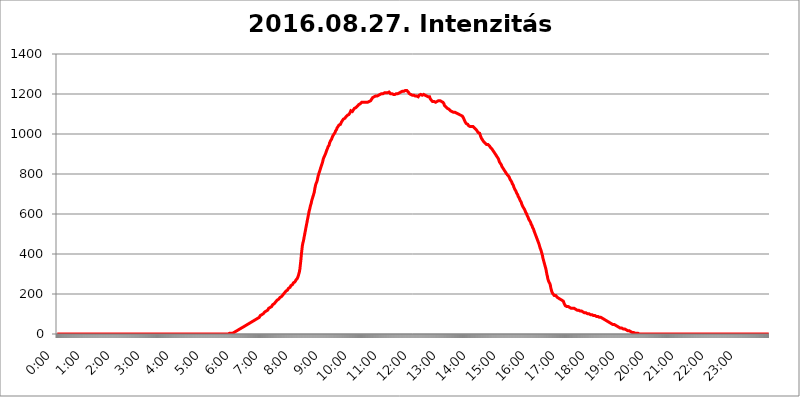
| Category | 2016.08.27. Intenzitás [W/m^2] |
|---|---|
| 0.0 | 0 |
| 0.0006944444444444445 | 0 |
| 0.001388888888888889 | 0 |
| 0.0020833333333333333 | 0 |
| 0.002777777777777778 | 0 |
| 0.003472222222222222 | 0 |
| 0.004166666666666667 | 0 |
| 0.004861111111111111 | 0 |
| 0.005555555555555556 | 0 |
| 0.0062499999999999995 | 0 |
| 0.006944444444444444 | 0 |
| 0.007638888888888889 | 0 |
| 0.008333333333333333 | 0 |
| 0.009027777777777779 | 0 |
| 0.009722222222222222 | 0 |
| 0.010416666666666666 | 0 |
| 0.011111111111111112 | 0 |
| 0.011805555555555555 | 0 |
| 0.012499999999999999 | 0 |
| 0.013194444444444444 | 0 |
| 0.013888888888888888 | 0 |
| 0.014583333333333332 | 0 |
| 0.015277777777777777 | 0 |
| 0.015972222222222224 | 0 |
| 0.016666666666666666 | 0 |
| 0.017361111111111112 | 0 |
| 0.018055555555555557 | 0 |
| 0.01875 | 0 |
| 0.019444444444444445 | 0 |
| 0.02013888888888889 | 0 |
| 0.020833333333333332 | 0 |
| 0.02152777777777778 | 0 |
| 0.022222222222222223 | 0 |
| 0.02291666666666667 | 0 |
| 0.02361111111111111 | 0 |
| 0.024305555555555556 | 0 |
| 0.024999999999999998 | 0 |
| 0.025694444444444447 | 0 |
| 0.02638888888888889 | 0 |
| 0.027083333333333334 | 0 |
| 0.027777777777777776 | 0 |
| 0.02847222222222222 | 0 |
| 0.029166666666666664 | 0 |
| 0.029861111111111113 | 0 |
| 0.030555555555555555 | 0 |
| 0.03125 | 0 |
| 0.03194444444444445 | 0 |
| 0.03263888888888889 | 0 |
| 0.03333333333333333 | 0 |
| 0.034027777777777775 | 0 |
| 0.034722222222222224 | 0 |
| 0.035416666666666666 | 0 |
| 0.036111111111111115 | 0 |
| 0.03680555555555556 | 0 |
| 0.0375 | 0 |
| 0.03819444444444444 | 0 |
| 0.03888888888888889 | 0 |
| 0.03958333333333333 | 0 |
| 0.04027777777777778 | 0 |
| 0.04097222222222222 | 0 |
| 0.041666666666666664 | 0 |
| 0.042361111111111106 | 0 |
| 0.04305555555555556 | 0 |
| 0.043750000000000004 | 0 |
| 0.044444444444444446 | 0 |
| 0.04513888888888889 | 0 |
| 0.04583333333333334 | 0 |
| 0.04652777777777778 | 0 |
| 0.04722222222222222 | 0 |
| 0.04791666666666666 | 0 |
| 0.04861111111111111 | 0 |
| 0.049305555555555554 | 0 |
| 0.049999999999999996 | 0 |
| 0.05069444444444445 | 0 |
| 0.051388888888888894 | 0 |
| 0.052083333333333336 | 0 |
| 0.05277777777777778 | 0 |
| 0.05347222222222222 | 0 |
| 0.05416666666666667 | 0 |
| 0.05486111111111111 | 0 |
| 0.05555555555555555 | 0 |
| 0.05625 | 0 |
| 0.05694444444444444 | 0 |
| 0.057638888888888885 | 0 |
| 0.05833333333333333 | 0 |
| 0.05902777777777778 | 0 |
| 0.059722222222222225 | 0 |
| 0.06041666666666667 | 0 |
| 0.061111111111111116 | 0 |
| 0.06180555555555556 | 0 |
| 0.0625 | 0 |
| 0.06319444444444444 | 0 |
| 0.06388888888888888 | 0 |
| 0.06458333333333334 | 0 |
| 0.06527777777777778 | 0 |
| 0.06597222222222222 | 0 |
| 0.06666666666666667 | 0 |
| 0.06736111111111111 | 0 |
| 0.06805555555555555 | 0 |
| 0.06874999999999999 | 0 |
| 0.06944444444444443 | 0 |
| 0.07013888888888889 | 0 |
| 0.07083333333333333 | 0 |
| 0.07152777777777779 | 0 |
| 0.07222222222222223 | 0 |
| 0.07291666666666667 | 0 |
| 0.07361111111111111 | 0 |
| 0.07430555555555556 | 0 |
| 0.075 | 0 |
| 0.07569444444444444 | 0 |
| 0.0763888888888889 | 0 |
| 0.07708333333333334 | 0 |
| 0.07777777777777778 | 0 |
| 0.07847222222222222 | 0 |
| 0.07916666666666666 | 0 |
| 0.0798611111111111 | 0 |
| 0.08055555555555556 | 0 |
| 0.08125 | 0 |
| 0.08194444444444444 | 0 |
| 0.08263888888888889 | 0 |
| 0.08333333333333333 | 0 |
| 0.08402777777777777 | 0 |
| 0.08472222222222221 | 0 |
| 0.08541666666666665 | 0 |
| 0.08611111111111112 | 0 |
| 0.08680555555555557 | 0 |
| 0.08750000000000001 | 0 |
| 0.08819444444444445 | 0 |
| 0.08888888888888889 | 0 |
| 0.08958333333333333 | 0 |
| 0.09027777777777778 | 0 |
| 0.09097222222222222 | 0 |
| 0.09166666666666667 | 0 |
| 0.09236111111111112 | 0 |
| 0.09305555555555556 | 0 |
| 0.09375 | 0 |
| 0.09444444444444444 | 0 |
| 0.09513888888888888 | 0 |
| 0.09583333333333333 | 0 |
| 0.09652777777777777 | 0 |
| 0.09722222222222222 | 0 |
| 0.09791666666666667 | 0 |
| 0.09861111111111111 | 0 |
| 0.09930555555555555 | 0 |
| 0.09999999999999999 | 0 |
| 0.10069444444444443 | 0 |
| 0.1013888888888889 | 0 |
| 0.10208333333333335 | 0 |
| 0.10277777777777779 | 0 |
| 0.10347222222222223 | 0 |
| 0.10416666666666667 | 0 |
| 0.10486111111111111 | 0 |
| 0.10555555555555556 | 0 |
| 0.10625 | 0 |
| 0.10694444444444444 | 0 |
| 0.1076388888888889 | 0 |
| 0.10833333333333334 | 0 |
| 0.10902777777777778 | 0 |
| 0.10972222222222222 | 0 |
| 0.1111111111111111 | 0 |
| 0.11180555555555556 | 0 |
| 0.11180555555555556 | 0 |
| 0.1125 | 0 |
| 0.11319444444444444 | 0 |
| 0.11388888888888889 | 0 |
| 0.11458333333333333 | 0 |
| 0.11527777777777777 | 0 |
| 0.11597222222222221 | 0 |
| 0.11666666666666665 | 0 |
| 0.1173611111111111 | 0 |
| 0.11805555555555557 | 0 |
| 0.11944444444444445 | 0 |
| 0.12013888888888889 | 0 |
| 0.12083333333333333 | 0 |
| 0.12152777777777778 | 0 |
| 0.12222222222222223 | 0 |
| 0.12291666666666667 | 0 |
| 0.12291666666666667 | 0 |
| 0.12361111111111112 | 0 |
| 0.12430555555555556 | 0 |
| 0.125 | 0 |
| 0.12569444444444444 | 0 |
| 0.12638888888888888 | 0 |
| 0.12708333333333333 | 0 |
| 0.16875 | 0 |
| 0.12847222222222224 | 0 |
| 0.12916666666666668 | 0 |
| 0.12986111111111112 | 0 |
| 0.13055555555555556 | 0 |
| 0.13125 | 0 |
| 0.13194444444444445 | 0 |
| 0.1326388888888889 | 0 |
| 0.13333333333333333 | 0 |
| 0.13402777777777777 | 0 |
| 0.13402777777777777 | 0 |
| 0.13472222222222222 | 0 |
| 0.13541666666666666 | 0 |
| 0.1361111111111111 | 0 |
| 0.13749999999999998 | 0 |
| 0.13819444444444443 | 0 |
| 0.1388888888888889 | 0 |
| 0.13958333333333334 | 0 |
| 0.14027777777777778 | 0 |
| 0.14097222222222222 | 0 |
| 0.14166666666666666 | 0 |
| 0.1423611111111111 | 0 |
| 0.14305555555555557 | 0 |
| 0.14375000000000002 | 0 |
| 0.14444444444444446 | 0 |
| 0.1451388888888889 | 0 |
| 0.1451388888888889 | 0 |
| 0.14652777777777778 | 0 |
| 0.14722222222222223 | 0 |
| 0.14791666666666667 | 0 |
| 0.1486111111111111 | 0 |
| 0.14930555555555555 | 0 |
| 0.15 | 0 |
| 0.15069444444444444 | 0 |
| 0.15138888888888888 | 0 |
| 0.15208333333333332 | 0 |
| 0.15277777777777776 | 0 |
| 0.15347222222222223 | 0 |
| 0.15416666666666667 | 0 |
| 0.15486111111111112 | 0 |
| 0.15555555555555556 | 0 |
| 0.15625 | 0 |
| 0.15694444444444444 | 0 |
| 0.15763888888888888 | 0 |
| 0.15833333333333333 | 0 |
| 0.15902777777777777 | 0 |
| 0.15972222222222224 | 0 |
| 0.16041666666666668 | 0 |
| 0.16111111111111112 | 0 |
| 0.16180555555555556 | 0 |
| 0.1625 | 0 |
| 0.16319444444444445 | 0 |
| 0.1638888888888889 | 0 |
| 0.16458333333333333 | 0 |
| 0.16527777777777777 | 0 |
| 0.16597222222222222 | 0 |
| 0.16666666666666666 | 0 |
| 0.1673611111111111 | 0 |
| 0.16805555555555554 | 0 |
| 0.16874999999999998 | 0 |
| 0.16944444444444443 | 0 |
| 0.17013888888888887 | 0 |
| 0.1708333333333333 | 0 |
| 0.17152777777777775 | 0 |
| 0.17222222222222225 | 0 |
| 0.1729166666666667 | 0 |
| 0.17361111111111113 | 0 |
| 0.17430555555555557 | 0 |
| 0.17500000000000002 | 0 |
| 0.17569444444444446 | 0 |
| 0.1763888888888889 | 0 |
| 0.17708333333333334 | 0 |
| 0.17777777777777778 | 0 |
| 0.17847222222222223 | 0 |
| 0.17916666666666667 | 0 |
| 0.1798611111111111 | 0 |
| 0.18055555555555555 | 0 |
| 0.18125 | 0 |
| 0.18194444444444444 | 0 |
| 0.1826388888888889 | 0 |
| 0.18333333333333335 | 0 |
| 0.1840277777777778 | 0 |
| 0.18472222222222223 | 0 |
| 0.18541666666666667 | 0 |
| 0.18611111111111112 | 0 |
| 0.18680555555555556 | 0 |
| 0.1875 | 0 |
| 0.18819444444444444 | 0 |
| 0.18888888888888888 | 0 |
| 0.18958333333333333 | 0 |
| 0.19027777777777777 | 0 |
| 0.1909722222222222 | 0 |
| 0.19166666666666665 | 0 |
| 0.19236111111111112 | 0 |
| 0.19305555555555554 | 0 |
| 0.19375 | 0 |
| 0.19444444444444445 | 0 |
| 0.1951388888888889 | 0 |
| 0.19583333333333333 | 0 |
| 0.19652777777777777 | 0 |
| 0.19722222222222222 | 0 |
| 0.19791666666666666 | 0 |
| 0.1986111111111111 | 0 |
| 0.19930555555555554 | 0 |
| 0.19999999999999998 | 0 |
| 0.20069444444444443 | 0 |
| 0.20138888888888887 | 0 |
| 0.2020833333333333 | 0 |
| 0.2027777777777778 | 0 |
| 0.2034722222222222 | 0 |
| 0.2041666666666667 | 0 |
| 0.20486111111111113 | 0 |
| 0.20555555555555557 | 0 |
| 0.20625000000000002 | 0 |
| 0.20694444444444446 | 0 |
| 0.2076388888888889 | 0 |
| 0.20833333333333334 | 0 |
| 0.20902777777777778 | 0 |
| 0.20972222222222223 | 0 |
| 0.21041666666666667 | 0 |
| 0.2111111111111111 | 0 |
| 0.21180555555555555 | 0 |
| 0.2125 | 0 |
| 0.21319444444444444 | 0 |
| 0.2138888888888889 | 0 |
| 0.21458333333333335 | 0 |
| 0.2152777777777778 | 0 |
| 0.21597222222222223 | 0 |
| 0.21666666666666667 | 0 |
| 0.21736111111111112 | 0 |
| 0.21805555555555556 | 0 |
| 0.21875 | 0 |
| 0.21944444444444444 | 0 |
| 0.22013888888888888 | 0 |
| 0.22083333333333333 | 0 |
| 0.22152777777777777 | 0 |
| 0.2222222222222222 | 0 |
| 0.22291666666666665 | 0 |
| 0.2236111111111111 | 0 |
| 0.22430555555555556 | 0 |
| 0.225 | 0 |
| 0.22569444444444445 | 0 |
| 0.2263888888888889 | 0 |
| 0.22708333333333333 | 0 |
| 0.22777777777777777 | 0 |
| 0.22847222222222222 | 0 |
| 0.22916666666666666 | 0 |
| 0.2298611111111111 | 0 |
| 0.23055555555555554 | 0 |
| 0.23124999999999998 | 0 |
| 0.23194444444444443 | 0 |
| 0.23263888888888887 | 0 |
| 0.2333333333333333 | 0 |
| 0.2340277777777778 | 0 |
| 0.2347222222222222 | 0 |
| 0.2354166666666667 | 0 |
| 0.23611111111111113 | 0 |
| 0.23680555555555557 | 0 |
| 0.23750000000000002 | 0 |
| 0.23819444444444446 | 0 |
| 0.2388888888888889 | 0 |
| 0.23958333333333334 | 0 |
| 0.24027777777777778 | 0 |
| 0.24097222222222223 | 3.525 |
| 0.24166666666666667 | 3.525 |
| 0.2423611111111111 | 3.525 |
| 0.24305555555555555 | 3.525 |
| 0.24375 | 3.525 |
| 0.24444444444444446 | 3.525 |
| 0.24513888888888888 | 3.525 |
| 0.24583333333333335 | 3.525 |
| 0.2465277777777778 | 7.887 |
| 0.24722222222222223 | 7.887 |
| 0.24791666666666667 | 7.887 |
| 0.24861111111111112 | 12.257 |
| 0.24930555555555556 | 12.257 |
| 0.25 | 12.257 |
| 0.25069444444444444 | 12.257 |
| 0.2513888888888889 | 12.257 |
| 0.2520833333333333 | 16.636 |
| 0.25277777777777777 | 16.636 |
| 0.2534722222222222 | 16.636 |
| 0.25416666666666665 | 21.024 |
| 0.2548611111111111 | 21.024 |
| 0.2555555555555556 | 21.024 |
| 0.25625000000000003 | 25.419 |
| 0.2569444444444445 | 25.419 |
| 0.2576388888888889 | 25.419 |
| 0.25833333333333336 | 29.823 |
| 0.2590277777777778 | 29.823 |
| 0.25972222222222224 | 34.234 |
| 0.2604166666666667 | 34.234 |
| 0.2611111111111111 | 34.234 |
| 0.26180555555555557 | 38.653 |
| 0.2625 | 38.653 |
| 0.26319444444444445 | 38.653 |
| 0.2638888888888889 | 38.653 |
| 0.26458333333333334 | 43.079 |
| 0.2652777777777778 | 43.079 |
| 0.2659722222222222 | 43.079 |
| 0.26666666666666666 | 47.511 |
| 0.2673611111111111 | 47.511 |
| 0.26805555555555555 | 47.511 |
| 0.26875 | 51.951 |
| 0.26944444444444443 | 51.951 |
| 0.2701388888888889 | 56.398 |
| 0.2708333333333333 | 56.398 |
| 0.27152777777777776 | 56.398 |
| 0.2722222222222222 | 56.398 |
| 0.27291666666666664 | 60.85 |
| 0.2736111111111111 | 60.85 |
| 0.2743055555555555 | 65.31 |
| 0.27499999999999997 | 65.31 |
| 0.27569444444444446 | 65.31 |
| 0.27638888888888885 | 69.775 |
| 0.27708333333333335 | 69.775 |
| 0.2777777777777778 | 74.246 |
| 0.27847222222222223 | 74.246 |
| 0.2791666666666667 | 74.246 |
| 0.2798611111111111 | 74.246 |
| 0.28055555555555556 | 78.722 |
| 0.28125 | 78.722 |
| 0.28194444444444444 | 83.205 |
| 0.2826388888888889 | 83.205 |
| 0.2833333333333333 | 83.205 |
| 0.28402777777777777 | 87.692 |
| 0.2847222222222222 | 92.184 |
| 0.28541666666666665 | 92.184 |
| 0.28611111111111115 | 92.184 |
| 0.28680555555555554 | 96.682 |
| 0.28750000000000003 | 101.184 |
| 0.2881944444444445 | 101.184 |
| 0.2888888888888889 | 101.184 |
| 0.28958333333333336 | 105.69 |
| 0.2902777777777778 | 105.69 |
| 0.29097222222222224 | 110.201 |
| 0.2916666666666667 | 110.201 |
| 0.2923611111111111 | 114.716 |
| 0.29305555555555557 | 114.716 |
| 0.29375 | 119.235 |
| 0.29444444444444445 | 119.235 |
| 0.2951388888888889 | 119.235 |
| 0.29583333333333334 | 123.758 |
| 0.2965277777777778 | 128.284 |
| 0.2972222222222222 | 128.284 |
| 0.29791666666666666 | 132.814 |
| 0.2986111111111111 | 132.814 |
| 0.29930555555555555 | 137.347 |
| 0.3 | 137.347 |
| 0.30069444444444443 | 137.347 |
| 0.3013888888888889 | 141.884 |
| 0.3020833333333333 | 146.423 |
| 0.30277777777777776 | 146.423 |
| 0.3034722222222222 | 146.423 |
| 0.30416666666666664 | 150.964 |
| 0.3048611111111111 | 155.509 |
| 0.3055555555555555 | 155.509 |
| 0.30624999999999997 | 160.056 |
| 0.3069444444444444 | 164.605 |
| 0.3076388888888889 | 164.605 |
| 0.30833333333333335 | 169.156 |
| 0.3090277777777778 | 169.156 |
| 0.30972222222222223 | 173.709 |
| 0.3104166666666667 | 173.709 |
| 0.3111111111111111 | 178.264 |
| 0.31180555555555556 | 178.264 |
| 0.3125 | 182.82 |
| 0.31319444444444444 | 182.82 |
| 0.3138888888888889 | 187.378 |
| 0.3145833333333333 | 187.378 |
| 0.31527777777777777 | 191.937 |
| 0.3159722222222222 | 191.937 |
| 0.31666666666666665 | 196.497 |
| 0.31736111111111115 | 201.058 |
| 0.31805555555555554 | 201.058 |
| 0.31875000000000003 | 205.62 |
| 0.3194444444444445 | 210.182 |
| 0.3201388888888889 | 210.182 |
| 0.32083333333333336 | 214.746 |
| 0.3215277777777778 | 214.746 |
| 0.32222222222222224 | 219.309 |
| 0.3229166666666667 | 219.309 |
| 0.3236111111111111 | 223.873 |
| 0.32430555555555557 | 228.436 |
| 0.325 | 228.436 |
| 0.32569444444444445 | 233 |
| 0.3263888888888889 | 233 |
| 0.32708333333333334 | 237.564 |
| 0.3277777777777778 | 242.127 |
| 0.3284722222222222 | 242.127 |
| 0.32916666666666666 | 246.689 |
| 0.3298611111111111 | 246.689 |
| 0.33055555555555555 | 251.251 |
| 0.33125 | 255.813 |
| 0.33194444444444443 | 255.813 |
| 0.3326388888888889 | 260.373 |
| 0.3333333333333333 | 260.373 |
| 0.3340277777777778 | 264.932 |
| 0.3347222222222222 | 269.49 |
| 0.3354166666666667 | 269.49 |
| 0.3361111111111111 | 274.047 |
| 0.3368055555555556 | 278.603 |
| 0.33749999999999997 | 283.156 |
| 0.33819444444444446 | 292.259 |
| 0.33888888888888885 | 296.808 |
| 0.33958333333333335 | 310.44 |
| 0.34027777777777773 | 324.052 |
| 0.34097222222222223 | 346.682 |
| 0.3416666666666666 | 369.23 |
| 0.3423611111111111 | 396.164 |
| 0.3430555555555555 | 418.492 |
| 0.34375 | 440.702 |
| 0.3444444444444445 | 453.968 |
| 0.3451388888888889 | 462.786 |
| 0.3458333333333334 | 475.972 |
| 0.34652777777777777 | 489.108 |
| 0.34722222222222227 | 502.192 |
| 0.34791666666666665 | 515.223 |
| 0.34861111111111115 | 528.2 |
| 0.34930555555555554 | 541.121 |
| 0.35000000000000003 | 553.986 |
| 0.3506944444444444 | 566.793 |
| 0.3513888888888889 | 579.542 |
| 0.3520833333333333 | 592.233 |
| 0.3527777777777778 | 604.864 |
| 0.3534722222222222 | 617.436 |
| 0.3541666666666667 | 625.784 |
| 0.3548611111111111 | 638.256 |
| 0.35555555555555557 | 646.537 |
| 0.35625 | 654.791 |
| 0.35694444444444445 | 667.123 |
| 0.3576388888888889 | 675.311 |
| 0.35833333333333334 | 683.473 |
| 0.3590277777777778 | 691.608 |
| 0.3597222222222222 | 695.666 |
| 0.36041666666666666 | 707.8 |
| 0.3611111111111111 | 723.889 |
| 0.36180555555555555 | 735.89 |
| 0.3625 | 747.834 |
| 0.36319444444444443 | 751.803 |
| 0.3638888888888889 | 759.723 |
| 0.3645833333333333 | 767.62 |
| 0.3652777777777778 | 779.42 |
| 0.3659722222222222 | 791.169 |
| 0.3666666666666667 | 798.974 |
| 0.3673611111111111 | 806.757 |
| 0.3680555555555556 | 814.519 |
| 0.36874999999999997 | 822.26 |
| 0.36944444444444446 | 829.981 |
| 0.37013888888888885 | 837.682 |
| 0.37083333333333335 | 845.365 |
| 0.37152777777777773 | 853.029 |
| 0.37222222222222223 | 860.676 |
| 0.3729166666666666 | 872.114 |
| 0.3736111111111111 | 879.719 |
| 0.3743055555555555 | 883.516 |
| 0.375 | 891.099 |
| 0.3756944444444445 | 894.885 |
| 0.3763888888888889 | 902.447 |
| 0.3770833333333334 | 909.996 |
| 0.37777777777777777 | 917.534 |
| 0.37847222222222227 | 921.298 |
| 0.37916666666666665 | 928.819 |
| 0.37986111111111115 | 936.33 |
| 0.38055555555555554 | 940.082 |
| 0.38125000000000003 | 943.832 |
| 0.3819444444444444 | 955.071 |
| 0.3826388888888889 | 958.814 |
| 0.3833333333333333 | 966.295 |
| 0.3840277777777778 | 970.034 |
| 0.3847222222222222 | 973.772 |
| 0.3854166666666667 | 981.244 |
| 0.3861111111111111 | 984.98 |
| 0.38680555555555557 | 992.448 |
| 0.3875 | 996.182 |
| 0.38819444444444445 | 999.916 |
| 0.3888888888888889 | 1003.65 |
| 0.38958333333333334 | 1007.383 |
| 0.3902777777777778 | 1014.852 |
| 0.3909722222222222 | 1018.587 |
| 0.39166666666666666 | 1022.323 |
| 0.3923611111111111 | 1029.798 |
| 0.39305555555555555 | 1033.537 |
| 0.39375 | 1037.277 |
| 0.39444444444444443 | 1037.277 |
| 0.3951388888888889 | 1044.762 |
| 0.3958333333333333 | 1044.762 |
| 0.3965277777777778 | 1048.508 |
| 0.3972222222222222 | 1048.508 |
| 0.3979166666666667 | 1052.255 |
| 0.3986111111111111 | 1059.756 |
| 0.3993055555555556 | 1063.51 |
| 0.39999999999999997 | 1067.267 |
| 0.40069444444444446 | 1067.267 |
| 0.40138888888888885 | 1074.789 |
| 0.40208333333333335 | 1074.789 |
| 0.40277777777777773 | 1074.789 |
| 0.40347222222222223 | 1078.555 |
| 0.4041666666666666 | 1082.324 |
| 0.4048611111111111 | 1086.097 |
| 0.4055555555555555 | 1086.097 |
| 0.40625 | 1089.873 |
| 0.4069444444444445 | 1093.653 |
| 0.4076388888888889 | 1097.437 |
| 0.4083333333333334 | 1097.437 |
| 0.40902777777777777 | 1097.437 |
| 0.40972222222222227 | 1101.226 |
| 0.41041666666666665 | 1105.019 |
| 0.41111111111111115 | 1108.816 |
| 0.41180555555555554 | 1116.426 |
| 0.41250000000000003 | 1112.618 |
| 0.4131944444444444 | 1112.618 |
| 0.4138888888888889 | 1112.618 |
| 0.4145833333333333 | 1116.426 |
| 0.4152777777777778 | 1120.238 |
| 0.4159722222222222 | 1124.056 |
| 0.4166666666666667 | 1127.879 |
| 0.4173611111111111 | 1131.708 |
| 0.41805555555555557 | 1131.708 |
| 0.41875 | 1131.708 |
| 0.41944444444444445 | 1131.708 |
| 0.4201388888888889 | 1131.708 |
| 0.42083333333333334 | 1139.384 |
| 0.4215277777777778 | 1139.384 |
| 0.4222222222222222 | 1143.232 |
| 0.42291666666666666 | 1147.086 |
| 0.4236111111111111 | 1143.232 |
| 0.42430555555555555 | 1147.086 |
| 0.425 | 1150.946 |
| 0.42569444444444443 | 1154.814 |
| 0.4263888888888889 | 1154.814 |
| 0.4270833333333333 | 1158.689 |
| 0.4277777777777778 | 1162.571 |
| 0.4284722222222222 | 1158.689 |
| 0.4291666666666667 | 1158.689 |
| 0.4298611111111111 | 1162.571 |
| 0.4305555555555556 | 1158.689 |
| 0.43124999999999997 | 1158.689 |
| 0.43194444444444446 | 1158.689 |
| 0.43263888888888885 | 1158.689 |
| 0.43333333333333335 | 1158.689 |
| 0.43402777777777773 | 1158.689 |
| 0.43472222222222223 | 1158.689 |
| 0.4354166666666666 | 1158.689 |
| 0.4361111111111111 | 1158.689 |
| 0.4368055555555555 | 1158.689 |
| 0.4375 | 1162.571 |
| 0.4381944444444445 | 1162.571 |
| 0.4388888888888889 | 1166.46 |
| 0.4395833333333334 | 1166.46 |
| 0.44027777777777777 | 1170.358 |
| 0.44097222222222227 | 1174.263 |
| 0.44166666666666665 | 1178.177 |
| 0.44236111111111115 | 1182.099 |
| 0.44305555555555554 | 1182.099 |
| 0.44375000000000003 | 1182.099 |
| 0.4444444444444444 | 1186.03 |
| 0.4451388888888889 | 1189.969 |
| 0.4458333333333333 | 1189.969 |
| 0.4465277777777778 | 1189.969 |
| 0.4472222222222222 | 1189.969 |
| 0.4479166666666667 | 1189.969 |
| 0.4486111111111111 | 1189.969 |
| 0.44930555555555557 | 1193.918 |
| 0.45 | 1193.918 |
| 0.45069444444444445 | 1193.918 |
| 0.4513888888888889 | 1193.918 |
| 0.45208333333333334 | 1193.918 |
| 0.4527777777777778 | 1197.876 |
| 0.4534722222222222 | 1201.843 |
| 0.45416666666666666 | 1201.843 |
| 0.4548611111111111 | 1201.843 |
| 0.45555555555555555 | 1201.843 |
| 0.45625 | 1201.843 |
| 0.45694444444444443 | 1201.843 |
| 0.4576388888888889 | 1205.82 |
| 0.4583333333333333 | 1201.843 |
| 0.4590277777777778 | 1205.82 |
| 0.4597222222222222 | 1205.82 |
| 0.4604166666666667 | 1205.82 |
| 0.4611111111111111 | 1205.82 |
| 0.4618055555555556 | 1205.82 |
| 0.46249999999999997 | 1209.807 |
| 0.46319444444444446 | 1205.82 |
| 0.46388888888888885 | 1209.807 |
| 0.46458333333333335 | 1209.807 |
| 0.46527777777777773 | 1209.807 |
| 0.46597222222222223 | 1213.804 |
| 0.4666666666666666 | 1205.82 |
| 0.4673611111111111 | 1201.843 |
| 0.4680555555555555 | 1197.876 |
| 0.46875 | 1197.876 |
| 0.4694444444444445 | 1201.843 |
| 0.4701388888888889 | 1201.843 |
| 0.4708333333333334 | 1197.876 |
| 0.47152777777777777 | 1197.876 |
| 0.47222222222222227 | 1197.876 |
| 0.47291666666666665 | 1197.876 |
| 0.47361111111111115 | 1197.876 |
| 0.47430555555555554 | 1197.876 |
| 0.47500000000000003 | 1201.843 |
| 0.4756944444444444 | 1201.843 |
| 0.4763888888888889 | 1201.843 |
| 0.4770833333333333 | 1201.843 |
| 0.4777777777777778 | 1201.843 |
| 0.4784722222222222 | 1201.843 |
| 0.4791666666666667 | 1205.82 |
| 0.4798611111111111 | 1205.82 |
| 0.48055555555555557 | 1209.807 |
| 0.48125 | 1209.807 |
| 0.48194444444444445 | 1209.807 |
| 0.4826388888888889 | 1213.804 |
| 0.48333333333333334 | 1213.804 |
| 0.4840277777777778 | 1213.804 |
| 0.4847222222222222 | 1213.804 |
| 0.48541666666666666 | 1217.812 |
| 0.4861111111111111 | 1213.804 |
| 0.48680555555555555 | 1217.812 |
| 0.4875 | 1217.812 |
| 0.48819444444444443 | 1217.812 |
| 0.4888888888888889 | 1213.804 |
| 0.4895833333333333 | 1213.804 |
| 0.4902777777777778 | 1217.812 |
| 0.4909722222222222 | 1217.812 |
| 0.4916666666666667 | 1213.804 |
| 0.4923611111111111 | 1209.807 |
| 0.4930555555555556 | 1205.82 |
| 0.49374999999999997 | 1201.843 |
| 0.49444444444444446 | 1201.843 |
| 0.49513888888888885 | 1197.876 |
| 0.49583333333333335 | 1197.876 |
| 0.49652777777777773 | 1197.876 |
| 0.49722222222222223 | 1193.918 |
| 0.4979166666666666 | 1193.918 |
| 0.4986111111111111 | 1193.918 |
| 0.4993055555555555 | 1193.918 |
| 0.5 | 1193.918 |
| 0.5006944444444444 | 1193.918 |
| 0.5013888888888889 | 1189.969 |
| 0.5020833333333333 | 1189.969 |
| 0.5027777777777778 | 1189.969 |
| 0.5034722222222222 | 1189.969 |
| 0.5041666666666667 | 1189.969 |
| 0.5048611111111111 | 1186.03 |
| 0.5055555555555555 | 1186.03 |
| 0.50625 | 1186.03 |
| 0.5069444444444444 | 1186.03 |
| 0.5076388888888889 | 1193.918 |
| 0.5083333333333333 | 1193.918 |
| 0.5090277777777777 | 1193.918 |
| 0.5097222222222222 | 1197.876 |
| 0.5104166666666666 | 1193.918 |
| 0.5111111111111112 | 1193.918 |
| 0.5118055555555555 | 1193.918 |
| 0.5125000000000001 | 1193.918 |
| 0.5131944444444444 | 1193.918 |
| 0.513888888888889 | 1197.876 |
| 0.5145833333333333 | 1193.918 |
| 0.5152777777777778 | 1193.918 |
| 0.5159722222222222 | 1193.918 |
| 0.5166666666666667 | 1189.969 |
| 0.517361111111111 | 1193.918 |
| 0.5180555555555556 | 1189.969 |
| 0.5187499999999999 | 1189.969 |
| 0.5194444444444445 | 1189.969 |
| 0.5201388888888888 | 1186.03 |
| 0.5208333333333334 | 1186.03 |
| 0.5215277777777778 | 1186.03 |
| 0.5222222222222223 | 1186.03 |
| 0.5229166666666667 | 1178.177 |
| 0.5236111111111111 | 1174.263 |
| 0.5243055555555556 | 1170.358 |
| 0.525 | 1166.46 |
| 0.5256944444444445 | 1166.46 |
| 0.5263888888888889 | 1162.571 |
| 0.5270833333333333 | 1162.571 |
| 0.5277777777777778 | 1162.571 |
| 0.5284722222222222 | 1162.571 |
| 0.5291666666666667 | 1162.571 |
| 0.5298611111111111 | 1162.571 |
| 0.5305555555555556 | 1158.689 |
| 0.53125 | 1158.689 |
| 0.5319444444444444 | 1162.571 |
| 0.5326388888888889 | 1162.571 |
| 0.5333333333333333 | 1166.46 |
| 0.5340277777777778 | 1166.46 |
| 0.5347222222222222 | 1166.46 |
| 0.5354166666666667 | 1166.46 |
| 0.5361111111111111 | 1166.46 |
| 0.5368055555555555 | 1166.46 |
| 0.5375 | 1166.46 |
| 0.5381944444444444 | 1166.46 |
| 0.5388888888888889 | 1162.571 |
| 0.5395833333333333 | 1162.571 |
| 0.5402777777777777 | 1162.571 |
| 0.5409722222222222 | 1158.689 |
| 0.5416666666666666 | 1158.689 |
| 0.5423611111111112 | 1150.946 |
| 0.5430555555555555 | 1143.232 |
| 0.5437500000000001 | 1139.384 |
| 0.5444444444444444 | 1139.384 |
| 0.545138888888889 | 1135.543 |
| 0.5458333333333333 | 1131.708 |
| 0.5465277777777778 | 1131.708 |
| 0.5472222222222222 | 1127.879 |
| 0.5479166666666667 | 1127.879 |
| 0.548611111111111 | 1124.056 |
| 0.5493055555555556 | 1124.056 |
| 0.5499999999999999 | 1120.238 |
| 0.5506944444444445 | 1120.238 |
| 0.5513888888888888 | 1116.426 |
| 0.5520833333333334 | 1116.426 |
| 0.5527777777777778 | 1112.618 |
| 0.5534722222222223 | 1112.618 |
| 0.5541666666666667 | 1108.816 |
| 0.5548611111111111 | 1108.816 |
| 0.5555555555555556 | 1108.816 |
| 0.55625 | 1105.019 |
| 0.5569444444444445 | 1108.816 |
| 0.5576388888888889 | 1108.816 |
| 0.5583333333333333 | 1105.019 |
| 0.5590277777777778 | 1105.019 |
| 0.5597222222222222 | 1105.019 |
| 0.5604166666666667 | 1105.019 |
| 0.5611111111111111 | 1101.226 |
| 0.5618055555555556 | 1101.226 |
| 0.5625 | 1097.437 |
| 0.5631944444444444 | 1097.437 |
| 0.5638888888888889 | 1097.437 |
| 0.5645833333333333 | 1097.437 |
| 0.5652777777777778 | 1097.437 |
| 0.5659722222222222 | 1093.653 |
| 0.5666666666666667 | 1093.653 |
| 0.5673611111111111 | 1089.873 |
| 0.5680555555555555 | 1089.873 |
| 0.56875 | 1086.097 |
| 0.5694444444444444 | 1082.324 |
| 0.5701388888888889 | 1078.555 |
| 0.5708333333333333 | 1071.027 |
| 0.5715277777777777 | 1067.267 |
| 0.5722222222222222 | 1059.756 |
| 0.5729166666666666 | 1056.004 |
| 0.5736111111111112 | 1052.255 |
| 0.5743055555555555 | 1052.255 |
| 0.5750000000000001 | 1048.508 |
| 0.5756944444444444 | 1048.508 |
| 0.576388888888889 | 1044.762 |
| 0.5770833333333333 | 1041.019 |
| 0.5777777777777778 | 1041.019 |
| 0.5784722222222222 | 1037.277 |
| 0.5791666666666667 | 1037.277 |
| 0.579861111111111 | 1041.019 |
| 0.5805555555555556 | 1041.019 |
| 0.5812499999999999 | 1037.277 |
| 0.5819444444444445 | 1037.277 |
| 0.5826388888888888 | 1037.277 |
| 0.5833333333333334 | 1037.277 |
| 0.5840277777777778 | 1033.537 |
| 0.5847222222222223 | 1033.537 |
| 0.5854166666666667 | 1029.798 |
| 0.5861111111111111 | 1029.798 |
| 0.5868055555555556 | 1026.06 |
| 0.5875 | 1022.323 |
| 0.5881944444444445 | 1018.587 |
| 0.5888888888888889 | 1014.852 |
| 0.5895833333333333 | 1011.118 |
| 0.5902777777777778 | 1007.383 |
| 0.5909722222222222 | 1007.383 |
| 0.5916666666666667 | 1003.65 |
| 0.5923611111111111 | 1003.65 |
| 0.5930555555555556 | 996.182 |
| 0.59375 | 988.714 |
| 0.5944444444444444 | 984.98 |
| 0.5951388888888889 | 977.508 |
| 0.5958333333333333 | 977.508 |
| 0.5965277777777778 | 970.034 |
| 0.5972222222222222 | 966.295 |
| 0.5979166666666667 | 962.555 |
| 0.5986111111111111 | 962.555 |
| 0.5993055555555555 | 958.814 |
| 0.6 | 955.071 |
| 0.6006944444444444 | 951.327 |
| 0.6013888888888889 | 951.327 |
| 0.6020833333333333 | 947.58 |
| 0.6027777777777777 | 947.58 |
| 0.6034722222222222 | 947.58 |
| 0.6041666666666666 | 947.58 |
| 0.6048611111111112 | 947.58 |
| 0.6055555555555555 | 943.832 |
| 0.6062500000000001 | 940.082 |
| 0.6069444444444444 | 936.33 |
| 0.607638888888889 | 932.576 |
| 0.6083333333333333 | 928.819 |
| 0.6090277777777778 | 928.819 |
| 0.6097222222222222 | 925.06 |
| 0.6104166666666667 | 921.298 |
| 0.611111111111111 | 917.534 |
| 0.6118055555555556 | 913.766 |
| 0.6124999999999999 | 909.996 |
| 0.6131944444444445 | 906.223 |
| 0.6138888888888888 | 902.447 |
| 0.6145833333333334 | 898.668 |
| 0.6152777777777778 | 894.885 |
| 0.6159722222222223 | 891.099 |
| 0.6166666666666667 | 887.309 |
| 0.6173611111111111 | 883.516 |
| 0.6180555555555556 | 883.516 |
| 0.61875 | 875.918 |
| 0.6194444444444445 | 868.305 |
| 0.6201388888888889 | 860.676 |
| 0.6208333333333333 | 860.676 |
| 0.6215277777777778 | 853.029 |
| 0.6222222222222222 | 849.199 |
| 0.6229166666666667 | 845.365 |
| 0.6236111111111111 | 837.682 |
| 0.6243055555555556 | 833.834 |
| 0.625 | 829.981 |
| 0.6256944444444444 | 826.123 |
| 0.6263888888888889 | 822.26 |
| 0.6270833333333333 | 818.392 |
| 0.6277777777777778 | 814.519 |
| 0.6284722222222222 | 814.519 |
| 0.6291666666666667 | 806.757 |
| 0.6298611111111111 | 802.868 |
| 0.6305555555555555 | 798.974 |
| 0.63125 | 798.974 |
| 0.6319444444444444 | 795.074 |
| 0.6326388888888889 | 791.169 |
| 0.6333333333333333 | 787.258 |
| 0.6340277777777777 | 783.342 |
| 0.6347222222222222 | 775.492 |
| 0.6354166666666666 | 775.492 |
| 0.6361111111111112 | 767.62 |
| 0.6368055555555555 | 763.674 |
| 0.6375000000000001 | 759.723 |
| 0.6381944444444444 | 751.803 |
| 0.638888888888889 | 747.834 |
| 0.6395833333333333 | 743.859 |
| 0.6402777777777778 | 735.89 |
| 0.6409722222222222 | 731.896 |
| 0.6416666666666667 | 723.889 |
| 0.642361111111111 | 719.877 |
| 0.6430555555555556 | 715.858 |
| 0.6437499999999999 | 711.832 |
| 0.6444444444444445 | 703.762 |
| 0.6451388888888888 | 699.717 |
| 0.6458333333333334 | 695.666 |
| 0.6465277777777778 | 687.544 |
| 0.6472222222222223 | 683.473 |
| 0.6479166666666667 | 679.395 |
| 0.6486111111111111 | 675.311 |
| 0.6493055555555556 | 667.123 |
| 0.65 | 663.019 |
| 0.6506944444444445 | 658.909 |
| 0.6513888888888889 | 650.667 |
| 0.6520833333333333 | 646.537 |
| 0.6527777777777778 | 638.256 |
| 0.6534722222222222 | 634.105 |
| 0.6541666666666667 | 629.948 |
| 0.6548611111111111 | 625.784 |
| 0.6555555555555556 | 621.613 |
| 0.65625 | 617.436 |
| 0.6569444444444444 | 609.062 |
| 0.6576388888888889 | 604.864 |
| 0.6583333333333333 | 600.661 |
| 0.6590277777777778 | 592.233 |
| 0.6597222222222222 | 592.233 |
| 0.6604166666666667 | 583.779 |
| 0.6611111111111111 | 575.299 |
| 0.6618055555555555 | 571.049 |
| 0.6625 | 566.793 |
| 0.6631944444444444 | 562.53 |
| 0.6638888888888889 | 558.261 |
| 0.6645833333333333 | 549.704 |
| 0.6652777777777777 | 545.416 |
| 0.6659722222222222 | 541.121 |
| 0.6666666666666666 | 532.513 |
| 0.6673611111111111 | 528.2 |
| 0.6680555555555556 | 523.88 |
| 0.6687500000000001 | 515.223 |
| 0.6694444444444444 | 510.885 |
| 0.6701388888888888 | 502.192 |
| 0.6708333333333334 | 497.836 |
| 0.6715277777777778 | 489.108 |
| 0.6722222222222222 | 484.735 |
| 0.6729166666666666 | 475.972 |
| 0.6736111111111112 | 471.582 |
| 0.6743055555555556 | 462.786 |
| 0.6749999999999999 | 458.38 |
| 0.6756944444444444 | 449.551 |
| 0.6763888888888889 | 440.702 |
| 0.6770833333333334 | 431.833 |
| 0.6777777777777777 | 427.39 |
| 0.6784722222222223 | 418.492 |
| 0.6791666666666667 | 409.574 |
| 0.6798611111111111 | 400.638 |
| 0.6805555555555555 | 391.685 |
| 0.68125 | 378.224 |
| 0.6819444444444445 | 369.23 |
| 0.6826388888888889 | 360.221 |
| 0.6833333333333332 | 351.198 |
| 0.6840277777777778 | 342.162 |
| 0.6847222222222222 | 333.113 |
| 0.6854166666666667 | 324.052 |
| 0.686111111111111 | 310.44 |
| 0.6868055555555556 | 296.808 |
| 0.6875 | 287.709 |
| 0.6881944444444444 | 274.047 |
| 0.688888888888889 | 269.49 |
| 0.6895833333333333 | 260.373 |
| 0.6902777777777778 | 255.813 |
| 0.6909722222222222 | 251.251 |
| 0.6916666666666668 | 242.127 |
| 0.6923611111111111 | 228.436 |
| 0.6930555555555555 | 219.309 |
| 0.69375 | 210.182 |
| 0.6944444444444445 | 205.62 |
| 0.6951388888888889 | 201.058 |
| 0.6958333333333333 | 196.497 |
| 0.6965277777777777 | 196.497 |
| 0.6972222222222223 | 191.937 |
| 0.6979166666666666 | 191.937 |
| 0.6986111111111111 | 191.937 |
| 0.6993055555555556 | 191.937 |
| 0.7000000000000001 | 187.378 |
| 0.7006944444444444 | 187.378 |
| 0.7013888888888888 | 182.82 |
| 0.7020833333333334 | 182.82 |
| 0.7027777777777778 | 178.264 |
| 0.7034722222222222 | 178.264 |
| 0.7041666666666666 | 173.709 |
| 0.7048611111111112 | 173.709 |
| 0.7055555555555556 | 173.709 |
| 0.7062499999999999 | 173.709 |
| 0.7069444444444444 | 169.156 |
| 0.7076388888888889 | 169.156 |
| 0.7083333333333334 | 164.605 |
| 0.7090277777777777 | 164.605 |
| 0.7097222222222223 | 164.605 |
| 0.7104166666666667 | 160.056 |
| 0.7111111111111111 | 150.964 |
| 0.7118055555555555 | 146.423 |
| 0.7125 | 141.884 |
| 0.7131944444444445 | 137.347 |
| 0.7138888888888889 | 137.347 |
| 0.7145833333333332 | 137.347 |
| 0.7152777777777778 | 137.347 |
| 0.7159722222222222 | 137.347 |
| 0.7166666666666667 | 137.347 |
| 0.717361111111111 | 132.814 |
| 0.7180555555555556 | 132.814 |
| 0.71875 | 132.814 |
| 0.7194444444444444 | 132.814 |
| 0.720138888888889 | 132.814 |
| 0.7208333333333333 | 128.284 |
| 0.7215277777777778 | 128.284 |
| 0.7222222222222222 | 128.284 |
| 0.7229166666666668 | 128.284 |
| 0.7236111111111111 | 128.284 |
| 0.7243055555555555 | 128.284 |
| 0.725 | 128.284 |
| 0.7256944444444445 | 123.758 |
| 0.7263888888888889 | 123.758 |
| 0.7270833333333333 | 123.758 |
| 0.7277777777777777 | 123.758 |
| 0.7284722222222223 | 123.758 |
| 0.7291666666666666 | 119.235 |
| 0.7298611111111111 | 119.235 |
| 0.7305555555555556 | 119.235 |
| 0.7312500000000001 | 119.235 |
| 0.7319444444444444 | 119.235 |
| 0.7326388888888888 | 119.235 |
| 0.7333333333333334 | 114.716 |
| 0.7340277777777778 | 114.716 |
| 0.7347222222222222 | 114.716 |
| 0.7354166666666666 | 114.716 |
| 0.7361111111111112 | 110.201 |
| 0.7368055555555556 | 110.201 |
| 0.7374999999999999 | 110.201 |
| 0.7381944444444444 | 110.201 |
| 0.7388888888888889 | 110.201 |
| 0.7395833333333334 | 105.69 |
| 0.7402777777777777 | 105.69 |
| 0.7409722222222223 | 105.69 |
| 0.7416666666666667 | 105.69 |
| 0.7423611111111111 | 105.69 |
| 0.7430555555555555 | 101.184 |
| 0.74375 | 101.184 |
| 0.7444444444444445 | 101.184 |
| 0.7451388888888889 | 101.184 |
| 0.7458333333333332 | 101.184 |
| 0.7465277777777778 | 101.184 |
| 0.7472222222222222 | 101.184 |
| 0.7479166666666667 | 96.682 |
| 0.748611111111111 | 96.682 |
| 0.7493055555555556 | 96.682 |
| 0.75 | 96.682 |
| 0.7506944444444444 | 96.682 |
| 0.751388888888889 | 96.682 |
| 0.7520833333333333 | 92.184 |
| 0.7527777777777778 | 92.184 |
| 0.7534722222222222 | 92.184 |
| 0.7541666666666668 | 92.184 |
| 0.7548611111111111 | 92.184 |
| 0.7555555555555555 | 92.184 |
| 0.75625 | 87.692 |
| 0.7569444444444445 | 87.692 |
| 0.7576388888888889 | 87.692 |
| 0.7583333333333333 | 87.692 |
| 0.7590277777777777 | 87.692 |
| 0.7597222222222223 | 83.205 |
| 0.7604166666666666 | 83.205 |
| 0.7611111111111111 | 83.205 |
| 0.7618055555555556 | 83.205 |
| 0.7625000000000001 | 83.205 |
| 0.7631944444444444 | 78.722 |
| 0.7638888888888888 | 78.722 |
| 0.7645833333333334 | 78.722 |
| 0.7652777777777778 | 78.722 |
| 0.7659722222222222 | 74.246 |
| 0.7666666666666666 | 74.246 |
| 0.7673611111111112 | 74.246 |
| 0.7680555555555556 | 69.775 |
| 0.7687499999999999 | 69.775 |
| 0.7694444444444444 | 65.31 |
| 0.7701388888888889 | 65.31 |
| 0.7708333333333334 | 65.31 |
| 0.7715277777777777 | 65.31 |
| 0.7722222222222223 | 60.85 |
| 0.7729166666666667 | 60.85 |
| 0.7736111111111111 | 60.85 |
| 0.7743055555555555 | 56.398 |
| 0.775 | 56.398 |
| 0.7756944444444445 | 56.398 |
| 0.7763888888888889 | 56.398 |
| 0.7770833333333332 | 51.951 |
| 0.7777777777777778 | 51.951 |
| 0.7784722222222222 | 47.511 |
| 0.7791666666666667 | 47.511 |
| 0.779861111111111 | 47.511 |
| 0.7805555555555556 | 47.511 |
| 0.78125 | 47.511 |
| 0.7819444444444444 | 43.079 |
| 0.782638888888889 | 43.079 |
| 0.7833333333333333 | 43.079 |
| 0.7840277777777778 | 38.653 |
| 0.7847222222222222 | 38.653 |
| 0.7854166666666668 | 38.653 |
| 0.7861111111111111 | 38.653 |
| 0.7868055555555555 | 38.653 |
| 0.7875 | 34.234 |
| 0.7881944444444445 | 34.234 |
| 0.7888888888888889 | 34.234 |
| 0.7895833333333333 | 29.823 |
| 0.7902777777777777 | 29.823 |
| 0.7909722222222223 | 29.823 |
| 0.7916666666666666 | 29.823 |
| 0.7923611111111111 | 29.823 |
| 0.7930555555555556 | 29.823 |
| 0.7937500000000001 | 25.419 |
| 0.7944444444444444 | 25.419 |
| 0.7951388888888888 | 25.419 |
| 0.7958333333333334 | 25.419 |
| 0.7965277777777778 | 21.024 |
| 0.7972222222222222 | 21.024 |
| 0.7979166666666666 | 21.024 |
| 0.7986111111111112 | 21.024 |
| 0.7993055555555556 | 21.024 |
| 0.7999999999999999 | 16.636 |
| 0.8006944444444444 | 16.636 |
| 0.8013888888888889 | 16.636 |
| 0.8020833333333334 | 16.636 |
| 0.8027777777777777 | 12.257 |
| 0.8034722222222223 | 12.257 |
| 0.8041666666666667 | 12.257 |
| 0.8048611111111111 | 12.257 |
| 0.8055555555555555 | 12.257 |
| 0.80625 | 7.887 |
| 0.8069444444444445 | 7.887 |
| 0.8076388888888889 | 7.887 |
| 0.8083333333333332 | 7.887 |
| 0.8090277777777778 | 7.887 |
| 0.8097222222222222 | 3.525 |
| 0.8104166666666667 | 3.525 |
| 0.811111111111111 | 3.525 |
| 0.8118055555555556 | 3.525 |
| 0.8125 | 3.525 |
| 0.8131944444444444 | 3.525 |
| 0.813888888888889 | 3.525 |
| 0.8145833333333333 | 3.525 |
| 0.8152777777777778 | 0 |
| 0.8159722222222222 | 0 |
| 0.8166666666666668 | 0 |
| 0.8173611111111111 | 0 |
| 0.8180555555555555 | 0 |
| 0.81875 | 0 |
| 0.8194444444444445 | 0 |
| 0.8201388888888889 | 0 |
| 0.8208333333333333 | 0 |
| 0.8215277777777777 | 0 |
| 0.8222222222222223 | 0 |
| 0.8229166666666666 | 0 |
| 0.8236111111111111 | 0 |
| 0.8243055555555556 | 0 |
| 0.8250000000000001 | 0 |
| 0.8256944444444444 | 0 |
| 0.8263888888888888 | 0 |
| 0.8270833333333334 | 0 |
| 0.8277777777777778 | 0 |
| 0.8284722222222222 | 0 |
| 0.8291666666666666 | 0 |
| 0.8298611111111112 | 0 |
| 0.8305555555555556 | 0 |
| 0.8312499999999999 | 0 |
| 0.8319444444444444 | 0 |
| 0.8326388888888889 | 0 |
| 0.8333333333333334 | 0 |
| 0.8340277777777777 | 0 |
| 0.8347222222222223 | 0 |
| 0.8354166666666667 | 0 |
| 0.8361111111111111 | 0 |
| 0.8368055555555555 | 0 |
| 0.8375 | 0 |
| 0.8381944444444445 | 0 |
| 0.8388888888888889 | 0 |
| 0.8395833333333332 | 0 |
| 0.8402777777777778 | 0 |
| 0.8409722222222222 | 0 |
| 0.8416666666666667 | 0 |
| 0.842361111111111 | 0 |
| 0.8430555555555556 | 0 |
| 0.84375 | 0 |
| 0.8444444444444444 | 0 |
| 0.845138888888889 | 0 |
| 0.8458333333333333 | 0 |
| 0.8465277777777778 | 0 |
| 0.8472222222222222 | 0 |
| 0.8479166666666668 | 0 |
| 0.8486111111111111 | 0 |
| 0.8493055555555555 | 0 |
| 0.85 | 0 |
| 0.8506944444444445 | 0 |
| 0.8513888888888889 | 0 |
| 0.8520833333333333 | 0 |
| 0.8527777777777777 | 0 |
| 0.8534722222222223 | 0 |
| 0.8541666666666666 | 0 |
| 0.8548611111111111 | 0 |
| 0.8555555555555556 | 0 |
| 0.8562500000000001 | 0 |
| 0.8569444444444444 | 0 |
| 0.8576388888888888 | 0 |
| 0.8583333333333334 | 0 |
| 0.8590277777777778 | 0 |
| 0.8597222222222222 | 0 |
| 0.8604166666666666 | 0 |
| 0.8611111111111112 | 0 |
| 0.8618055555555556 | 0 |
| 0.8624999999999999 | 0 |
| 0.8631944444444444 | 0 |
| 0.8638888888888889 | 0 |
| 0.8645833333333334 | 0 |
| 0.8652777777777777 | 0 |
| 0.8659722222222223 | 0 |
| 0.8666666666666667 | 0 |
| 0.8673611111111111 | 0 |
| 0.8680555555555555 | 0 |
| 0.86875 | 0 |
| 0.8694444444444445 | 0 |
| 0.8701388888888889 | 0 |
| 0.8708333333333332 | 0 |
| 0.8715277777777778 | 0 |
| 0.8722222222222222 | 0 |
| 0.8729166666666667 | 0 |
| 0.873611111111111 | 0 |
| 0.8743055555555556 | 0 |
| 0.875 | 0 |
| 0.8756944444444444 | 0 |
| 0.876388888888889 | 0 |
| 0.8770833333333333 | 0 |
| 0.8777777777777778 | 0 |
| 0.8784722222222222 | 0 |
| 0.8791666666666668 | 0 |
| 0.8798611111111111 | 0 |
| 0.8805555555555555 | 0 |
| 0.88125 | 0 |
| 0.8819444444444445 | 0 |
| 0.8826388888888889 | 0 |
| 0.8833333333333333 | 0 |
| 0.8840277777777777 | 0 |
| 0.8847222222222223 | 0 |
| 0.8854166666666666 | 0 |
| 0.8861111111111111 | 0 |
| 0.8868055555555556 | 0 |
| 0.8875000000000001 | 0 |
| 0.8881944444444444 | 0 |
| 0.8888888888888888 | 0 |
| 0.8895833333333334 | 0 |
| 0.8902777777777778 | 0 |
| 0.8909722222222222 | 0 |
| 0.8916666666666666 | 0 |
| 0.8923611111111112 | 0 |
| 0.8930555555555556 | 0 |
| 0.8937499999999999 | 0 |
| 0.8944444444444444 | 0 |
| 0.8951388888888889 | 0 |
| 0.8958333333333334 | 0 |
| 0.8965277777777777 | 0 |
| 0.8972222222222223 | 0 |
| 0.8979166666666667 | 0 |
| 0.8986111111111111 | 0 |
| 0.8993055555555555 | 0 |
| 0.9 | 0 |
| 0.9006944444444445 | 0 |
| 0.9013888888888889 | 0 |
| 0.9020833333333332 | 0 |
| 0.9027777777777778 | 0 |
| 0.9034722222222222 | 0 |
| 0.9041666666666667 | 0 |
| 0.904861111111111 | 0 |
| 0.9055555555555556 | 0 |
| 0.90625 | 0 |
| 0.9069444444444444 | 0 |
| 0.907638888888889 | 0 |
| 0.9083333333333333 | 0 |
| 0.9090277777777778 | 0 |
| 0.9097222222222222 | 0 |
| 0.9104166666666668 | 0 |
| 0.9111111111111111 | 0 |
| 0.9118055555555555 | 0 |
| 0.9125 | 0 |
| 0.9131944444444445 | 0 |
| 0.9138888888888889 | 0 |
| 0.9145833333333333 | 0 |
| 0.9152777777777777 | 0 |
| 0.9159722222222223 | 0 |
| 0.9166666666666666 | 0 |
| 0.9173611111111111 | 0 |
| 0.9180555555555556 | 0 |
| 0.9187500000000001 | 0 |
| 0.9194444444444444 | 0 |
| 0.9201388888888888 | 0 |
| 0.9208333333333334 | 0 |
| 0.9215277777777778 | 0 |
| 0.9222222222222222 | 0 |
| 0.9229166666666666 | 0 |
| 0.9236111111111112 | 0 |
| 0.9243055555555556 | 0 |
| 0.9249999999999999 | 0 |
| 0.9256944444444444 | 0 |
| 0.9263888888888889 | 0 |
| 0.9270833333333334 | 0 |
| 0.9277777777777777 | 0 |
| 0.9284722222222223 | 0 |
| 0.9291666666666667 | 0 |
| 0.9298611111111111 | 0 |
| 0.9305555555555555 | 0 |
| 0.93125 | 0 |
| 0.9319444444444445 | 0 |
| 0.9326388888888889 | 0 |
| 0.9333333333333332 | 0 |
| 0.9340277777777778 | 0 |
| 0.9347222222222222 | 0 |
| 0.9354166666666667 | 0 |
| 0.936111111111111 | 0 |
| 0.9368055555555556 | 0 |
| 0.9375 | 0 |
| 0.9381944444444444 | 0 |
| 0.938888888888889 | 0 |
| 0.9395833333333333 | 0 |
| 0.9402777777777778 | 0 |
| 0.9409722222222222 | 0 |
| 0.9416666666666668 | 0 |
| 0.9423611111111111 | 0 |
| 0.9430555555555555 | 0 |
| 0.94375 | 0 |
| 0.9444444444444445 | 0 |
| 0.9451388888888889 | 0 |
| 0.9458333333333333 | 0 |
| 0.9465277777777777 | 0 |
| 0.9472222222222223 | 0 |
| 0.9479166666666666 | 0 |
| 0.9486111111111111 | 0 |
| 0.9493055555555556 | 0 |
| 0.9500000000000001 | 0 |
| 0.9506944444444444 | 0 |
| 0.9513888888888888 | 0 |
| 0.9520833333333334 | 0 |
| 0.9527777777777778 | 0 |
| 0.9534722222222222 | 0 |
| 0.9541666666666666 | 0 |
| 0.9548611111111112 | 0 |
| 0.9555555555555556 | 0 |
| 0.9562499999999999 | 0 |
| 0.9569444444444444 | 0 |
| 0.9576388888888889 | 0 |
| 0.9583333333333334 | 0 |
| 0.9590277777777777 | 0 |
| 0.9597222222222223 | 0 |
| 0.9604166666666667 | 0 |
| 0.9611111111111111 | 0 |
| 0.9618055555555555 | 0 |
| 0.9625 | 0 |
| 0.9631944444444445 | 0 |
| 0.9638888888888889 | 0 |
| 0.9645833333333332 | 0 |
| 0.9652777777777778 | 0 |
| 0.9659722222222222 | 0 |
| 0.9666666666666667 | 0 |
| 0.967361111111111 | 0 |
| 0.9680555555555556 | 0 |
| 0.96875 | 0 |
| 0.9694444444444444 | 0 |
| 0.970138888888889 | 0 |
| 0.9708333333333333 | 0 |
| 0.9715277777777778 | 0 |
| 0.9722222222222222 | 0 |
| 0.9729166666666668 | 0 |
| 0.9736111111111111 | 0 |
| 0.9743055555555555 | 0 |
| 0.975 | 0 |
| 0.9756944444444445 | 0 |
| 0.9763888888888889 | 0 |
| 0.9770833333333333 | 0 |
| 0.9777777777777777 | 0 |
| 0.9784722222222223 | 0 |
| 0.9791666666666666 | 0 |
| 0.9798611111111111 | 0 |
| 0.9805555555555556 | 0 |
| 0.9812500000000001 | 0 |
| 0.9819444444444444 | 0 |
| 0.9826388888888888 | 0 |
| 0.9833333333333334 | 0 |
| 0.9840277777777778 | 0 |
| 0.9847222222222222 | 0 |
| 0.9854166666666666 | 0 |
| 0.9861111111111112 | 0 |
| 0.9868055555555556 | 0 |
| 0.9874999999999999 | 0 |
| 0.9881944444444444 | 0 |
| 0.9888888888888889 | 0 |
| 0.9895833333333334 | 0 |
| 0.9902777777777777 | 0 |
| 0.9909722222222223 | 0 |
| 0.9916666666666667 | 0 |
| 0.9923611111111111 | 0 |
| 0.9930555555555555 | 0 |
| 0.99375 | 0 |
| 0.9944444444444445 | 0 |
| 0.9951388888888889 | 0 |
| 0.9958333333333332 | 0 |
| 0.9965277777777778 | 0 |
| 0.9972222222222222 | 0 |
| 0.9979166666666667 | 0 |
| 0.998611111111111 | 0 |
| 0.9993055555555556 | 0 |